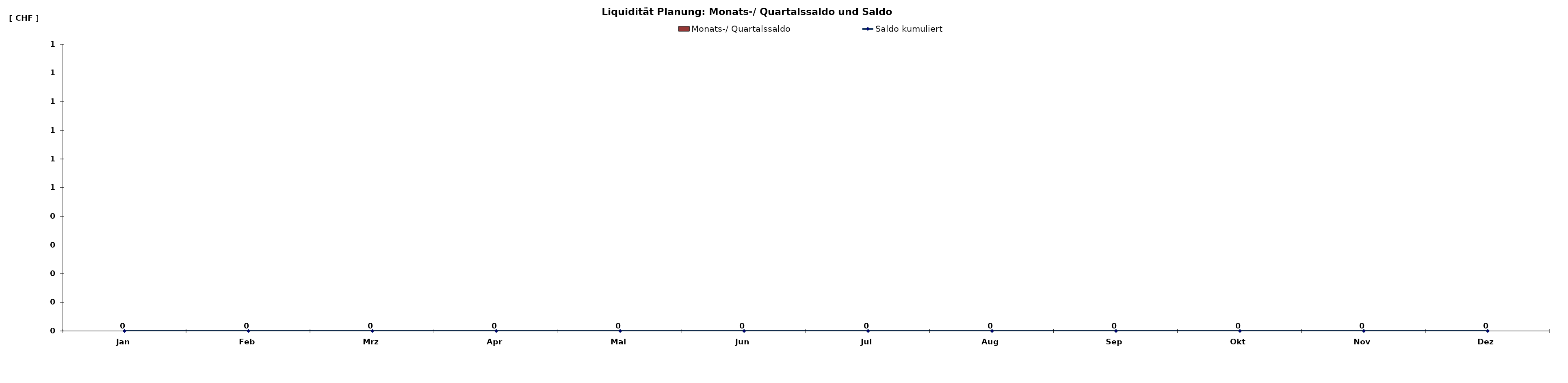
| Category | Monats-/ Quartalssaldo |
|---|---|
| Jan | 0 |
| Feb | 0 |
| Mrz | 0 |
| Apr | 0 |
| Mai | 0 |
| Jun | 0 |
| Jul | 0 |
| Aug | 0 |
| Sep | 0 |
| Okt | 0 |
| Nov | 0 |
| Dez | 0 |